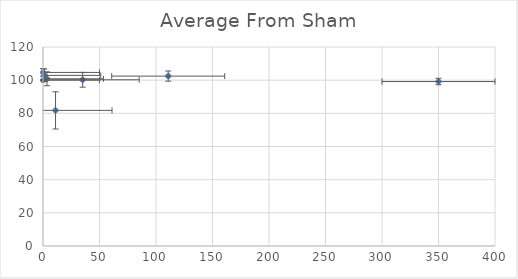
| Category | Average From Sham |
|---|---|
| 350.0 | 99.175 |
| 110.8 | 102.455 |
| 35.1 | 100.237 |
| 11.1 | 81.769 |
| 3.51 | 100.834 |
| 1.11 | 102.889 |
| 0.0 | 100 |
| 0.0 | 104.661 |